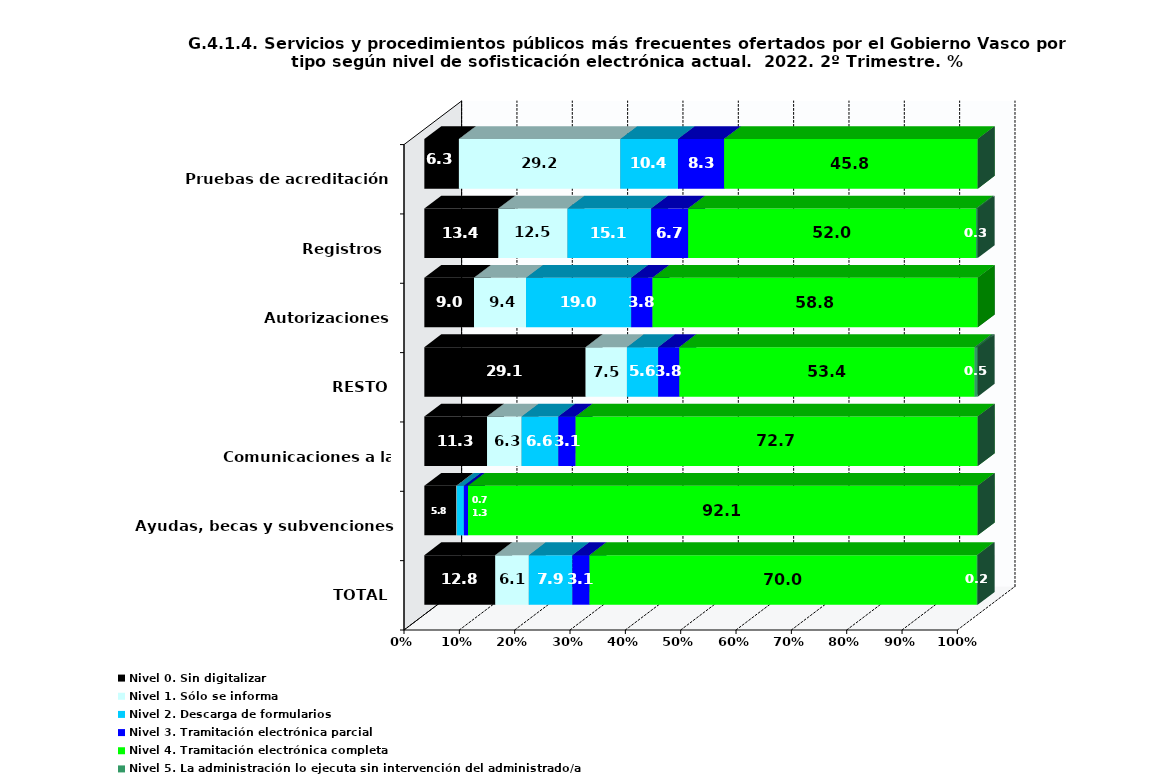
| Category | Nivel 0. Sin digitalizar | Nivel 1. Sólo se informa | Nivel 2. Descarga de formularios | Nivel 3. Tramitación electrónica parcial | Nivel 4. Tramitación electrónica completa | Nivel 5. La administración lo ejecuta sin intervención del administrado/a |
|---|---|---|---|---|---|---|
| TOTAL | 12.806 | 6.078 | 7.875 | 3.096 | 69.992 | 0.153 |
| Ayudas, becas y subvenciones | 5.783 | 0.105 | 1.262 | 0.736 | 92.114 | 0 |
| Comunicaciones a la Administración | 11.328 | 6.25 | 6.641 | 3.125 | 72.656 | 0 |
| RESTO | 29.144 | 7.468 | 5.647 | 3.825 | 53.37 | 0.546 |
| Autorizaciones | 8.974 | 9.402 | 19.017 | 3.846 | 58.761 | 0 |
| Registros  | 13.372 | 12.5 | 15.116 | 6.686 | 52.035 | 0.291 |
| Pruebas de acreditación | 6.25 | 29.167 | 10.417 | 8.333 | 45.833 | 0 |